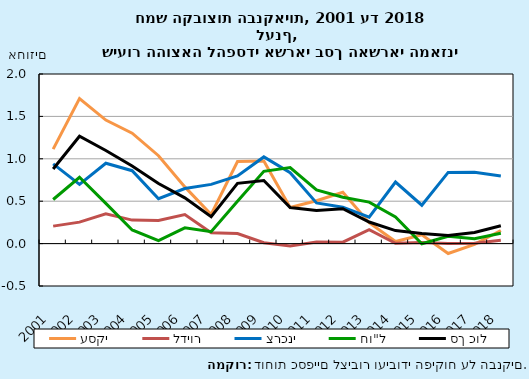
| Category | עסקי | לדיור | צרכני | חו"ל | סך כול |
|---|---|---|---|---|---|
| 2001.0 | 1.114 | 0.206 | 0.939 | 0.52 | 0.88 |
| 2002.0 | 1.709 | 0.253 | 0.698 | 0.783 | 1.266 |
| 2003.0 | 1.457 | 0.351 | 0.947 | 0.475 | 1.098 |
| 2004.0 | 1.302 | 0.277 | 0.86 | 0.161 | 0.916 |
| 2005.0 | 1.036 | 0.273 | 0.529 | 0.035 | 0.709 |
| 2006.0 | 0.669 | 0.342 | 0.65 | 0.186 | 0.54 |
| 2007.0 | 0.344 | 0.127 | 0.698 | 0.141 | 0.318 |
| 2008.0 | 0.968 | 0.119 | 0.798 | 0.5 | 0.71 |
| 2009.0 | 0.974 | 0.011 | 1.022 | 0.852 | 0.744 |
| 2010.0 | 0.426 | -0.028 | 0.836 | 0.897 | 0.426 |
| 2011.0 | 0.505 | 0.018 | 0.479 | 0.633 | 0.391 |
| 2012.0 | 0.605 | 0.017 | 0.43 | 0.546 | 0.411 |
| 2013.0 | 0.247 | 0.163 | 0.31 | 0.489 | 0.254 |
| 2014.0 | 0.025 | 0.003 | 0.726 | 0.314 | 0.154 |
| 2015.0 | 0.104 | 0.012 | 0.452 | -0.001 | 0.12 |
| 2016.0 | -0.117 | 0.003 | 0.84 | 0.087 | 0.096 |
| 2017.0 | -0.009 | 0.005 | 0.841 | 0.058 | 0.131 |
| 2018.0 | 0.155 | 0.04 | 0.797 | 0.122 | 0.21 |